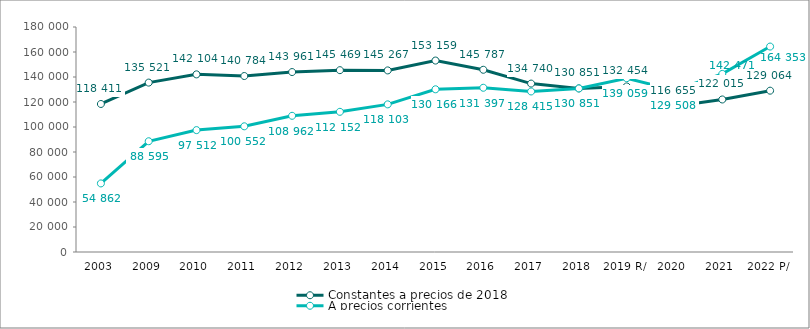
| Category | Constantes a precios de 2018 | A precios corrientes |
|---|---|---|
| 2003 | 118411.231 | 54862.083 |
| 2009 | 135520.602 | 88594.501 |
| 2010 | 142104.306 | 97511.825 |
| 2011 | 140783.978 | 100552.437 |
| 2012 | 143960.995 | 108961.556 |
| 2013 | 145469.028 | 112152.153 |
| 2014 | 145266.759 | 118102.666 |
| 2015 | 153159.433 | 130166.13 |
| 2016 | 145786.863 | 131397.072 |
| 2017 | 134740.24 | 128415.431 |
| 2018 | 130850.949 | 130850.949 |
| 2019 R/ | 132454.346 | 139059.004 |
| 2020 | 116654.696 | 129507.996 |
| 2021 | 122015.271 | 142470.952 |
| 2022 P/ | 129063.574 | 164352.816 |